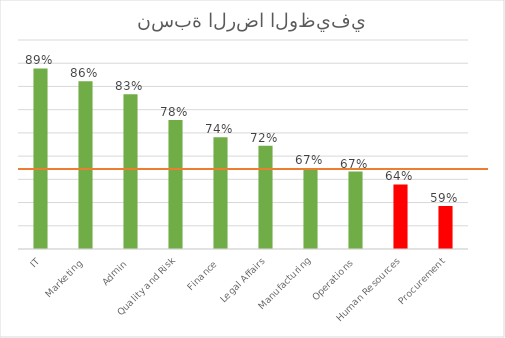
| Category | % |
|---|---|
| IT | 0.889 |
| Marketing | 0.861 |
| Admin | 0.833 |
| Quality and Risk | 0.778 |
| Finance | 0.741 |
| Legal Affairs | 0.722 |
| Manufacturing | 0.674 |
| Operations | 0.667 |
| Human Resources | 0.639 |
| Procurement | 0.593 |